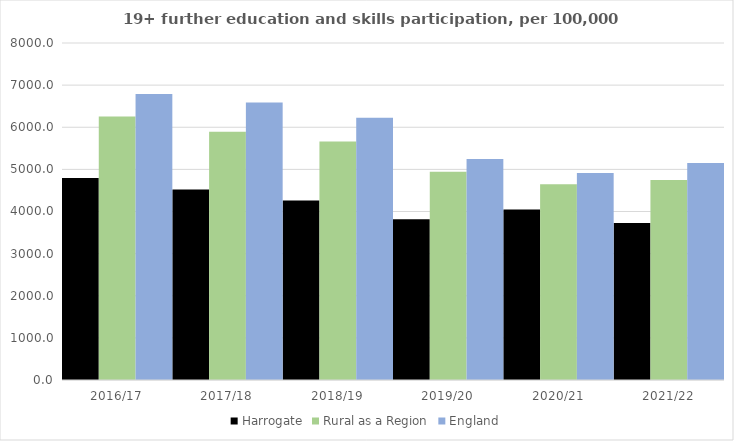
| Category | Harrogate | Rural as a Region | England |
|---|---|---|---|
| 2016/17 | 4793 | 6253.401 | 6788 |
| 2017/18 | 4524 | 5892.029 | 6588 |
| 2018/19 | 4259 | 5661.873 | 6227 |
| 2019/20 | 3817 | 4943.801 | 5244 |
| 2020/21 | 4050 | 4646.727 | 4913 |
| 2021/22 | 3726 | 4747.049 | 5151 |